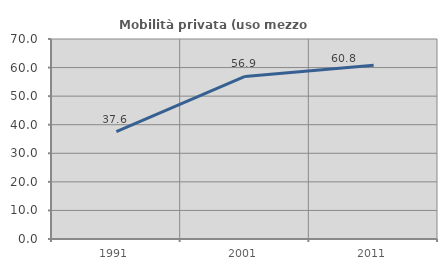
| Category | Mobilità privata (uso mezzo privato) |
|---|---|
| 1991.0 | 37.559 |
| 2001.0 | 56.885 |
| 2011.0 | 60.848 |